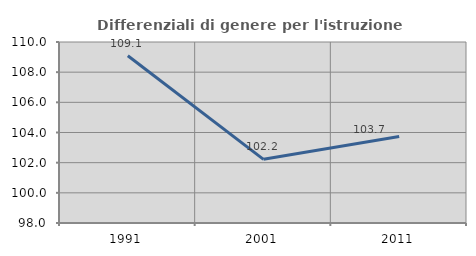
| Category | Differenziali di genere per l'istruzione superiore |
|---|---|
| 1991.0 | 109.086 |
| 2001.0 | 102.221 |
| 2011.0 | 103.737 |